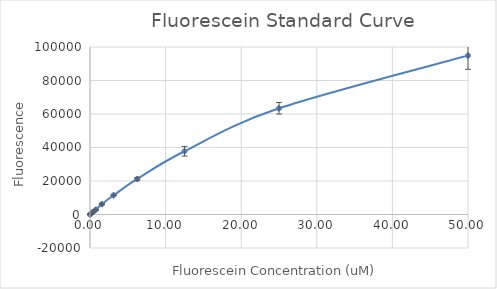
| Category | Series 0 |
|---|---|
| 50.0 | 94904.568 |
| 25.0 | 63391.424 |
| 12.5 | 37758.796 |
| 6.25 | 21216.663 |
| 3.125 | 11473.958 |
| 1.5625 | 6158.226 |
| 0.78125 | 2872.047 |
| 0.390625 | 1493.664 |
| 0.1953125 | 739.85 |
| 0.09765625 | 374.954 |
| 0.048828125 | 193.308 |
| 0.0 | -2.006 |